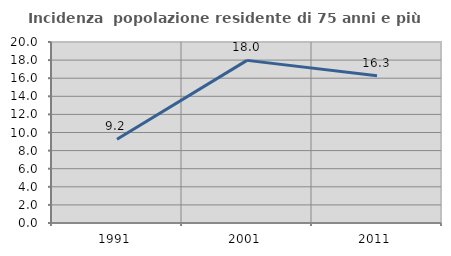
| Category | Incidenza  popolazione residente di 75 anni e più |
|---|---|
| 1991.0 | 9.249 |
| 2001.0 | 17.969 |
| 2011.0 | 16.26 |